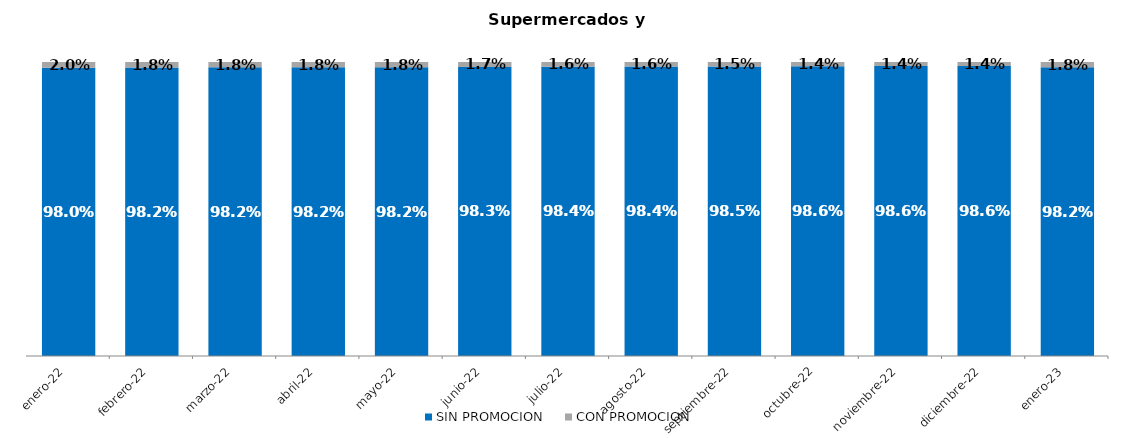
| Category | SIN PROMOCION   | CON PROMOCION   |
|---|---|---|
| 2022-01-01 | 0.98 | 0.02 |
| 2022-02-01 | 0.982 | 0.018 |
| 2022-03-01 | 0.982 | 0.018 |
| 2022-04-01 | 0.982 | 0.018 |
| 2022-05-01 | 0.982 | 0.018 |
| 2022-06-01 | 0.983 | 0.017 |
| 2022-07-01 | 0.984 | 0.016 |
| 2022-08-01 | 0.984 | 0.016 |
| 2022-09-01 | 0.985 | 0.015 |
| 2022-10-01 | 0.986 | 0.014 |
| 2022-11-01 | 0.986 | 0.014 |
| 2022-12-01 | 0.986 | 0.014 |
| 2023-01-01 | 0.982 | 0.018 |